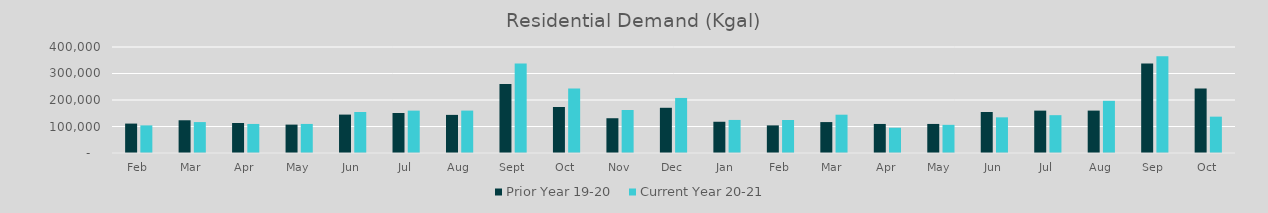
| Category | Prior Year 19-20  | Current Year 20-21 |
|---|---|---|
| Feb | 111009.962 | 104204.224 |
| Mar | 123525.131 | 116687.491 |
| Apr | 113258.787 | 109598.965 |
| May | 107128.051 | 109656.015 |
| Jun | 144930.453 | 154696.236 |
| Jul | 151028.014 | 159889.353 |
| Aug | 143816.337 | 160013.985 |
| Sep | 260607.456 | 337995.641 |
| Oct | 173601.368 | 243049.084 |
| Nov | 131198.833 | 162175.563 |
| Dec | 170629.384 | 207737.904 |
| Jan | 117899.625 | 124779.797 |
| Feb | 104204.224 | 124538.238 |
| Mar | 116687.491 | 144510.137 |
| Apr | 109598.965 | 95313.825 |
| May | 109656.015 | 106271.913 |
| Jun | 154696.236 | 134556.172 |
| Jul | 159889.353 | 142779.003 |
| Aug | 160013.985 | 196888.231 |
| Sep | 337995.641 | 364911.478 |
| Oct | 243049.084 | 137121.969 |